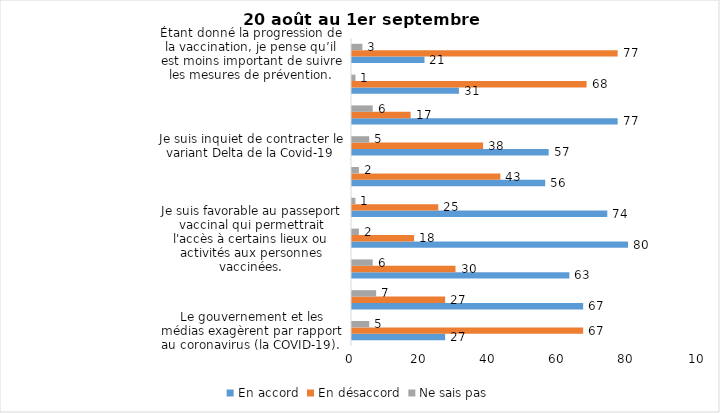
| Category | En accord | En désaccord | Ne sais pas |
|---|---|---|---|
| Le gouvernement et les médias exagèrent par rapport au coronavirus (la COVID-19). | 27 | 67 | 5 |
| J’ai peur que le système de santé soit débordé par les cas de COVID-19 suite au "déconfinement" | 67 | 27 | 7 |
| J’ai peur que la reprise des cours en présentiel dans les cégeps et les universités génère une augmentation des cas de COVID-19. | 63 | 30 | 6 |
| Je suis favorable au passeport vaccinal qui permettrait l'accès à certains lieux ou activités aux personnes vaccinées. | 80 | 18 | 2 |
| Malgré la levée des mesures de confinement, je préfère limiter mes contacts avec d’autres personnes (par ex., en évitant les activités sociales et de groupes) | 74 | 25 | 1 |
| Si les cas de COVID-19 augmentent cet automne, je suis favorable à la mise en place de mesures de confinement (ex. fermeture de services non essentiels, interdiction des rassemblements privés) | 56 | 43 | 2 |
| Je suis inquiet de contracter le variant Delta de la Covid-19 | 57 | 38 | 5 |
| Je suis confiant que la vaccination protège efficacement contre les variants de la COVID-19 | 77 | 17 | 6 |
| Je suis favorable à ce que le port du masque ne soit plus obligatoire au Québec. | 31 | 68 | 1 |
| Étant donné la progression de la vaccination, je pense qu’il est moins important de suivre les mesures de prévention. | 21 | 77 | 3 |